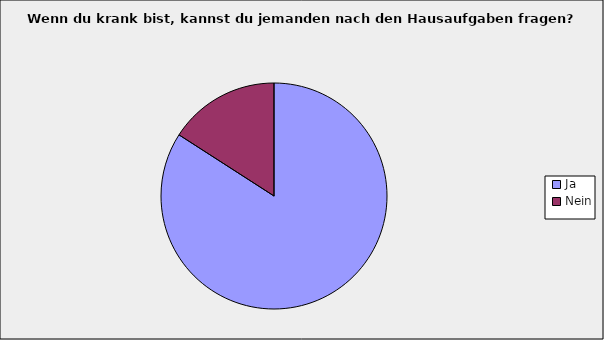
| Category | Series 0 |
|---|---|
| Ja | 0.841 |
| Nein | 0.159 |